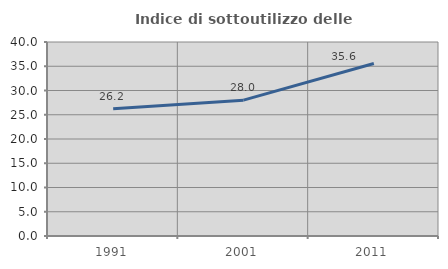
| Category | Indice di sottoutilizzo delle abitazioni  |
|---|---|
| 1991.0 | 26.219 |
| 2001.0 | 28.011 |
| 2011.0 | 35.564 |